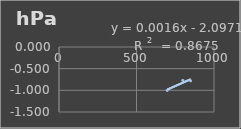
| Category | Presión Atmosférica |
|---|---|
| 698.2 | -1.002 |
| 798.4 | -0.77 |
| 848.7 | -0.78 |